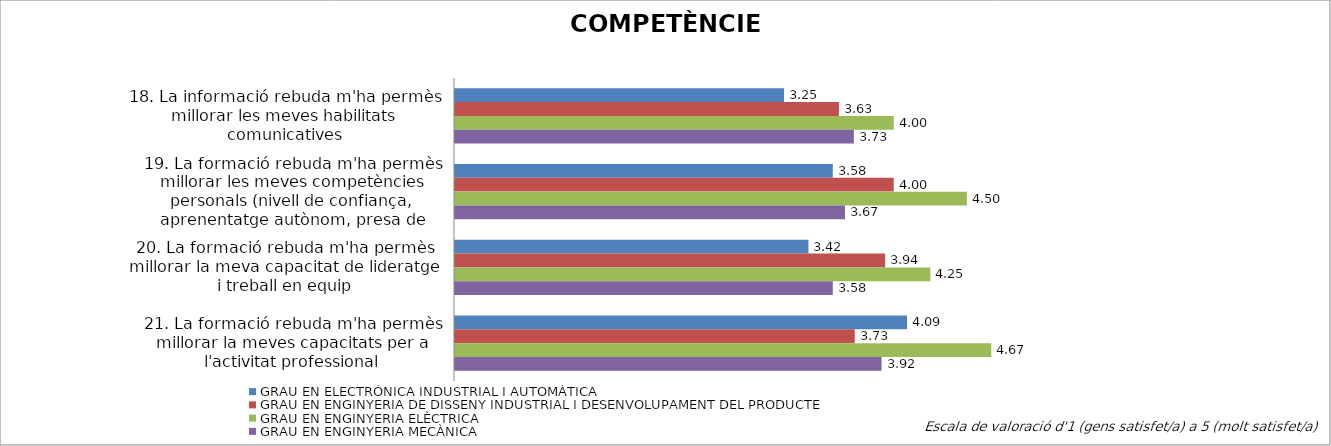
| Category | GRAU EN ELECTRÒNICA INDUSTRIAL I AUTOMÀTICA | GRAU EN ENGINYERIA DE DISSENY INDUSTRIAL I DESENVOLUPAMENT DEL PRODUCTE | GRAU EN ENGINYERIA ELÈCTRICA | GRAU EN ENGINYERIA MECÀNICA |
|---|---|---|---|---|
| 18. La informació rebuda m'ha permès millorar les meves habilitats comunicatives | 3.25 | 3.625 | 4 | 3.727 |
| 19. La formació rebuda m'ha permès millorar les meves competències personals (nivell de confiança, aprenentatge autònom, presa de decisions,..)  | 3.583 | 4 | 4.5 | 3.667 |
| 20. La formació rebuda m'ha permès millorar la meva capacitat de lideratge i treball en equip | 3.417 | 3.941 | 4.25 | 3.583 |
| 21. La formació rebuda m'ha permès millorar la meves capacitats per a l'activitat professional | 4.091 | 3.733 | 4.667 | 3.917 |